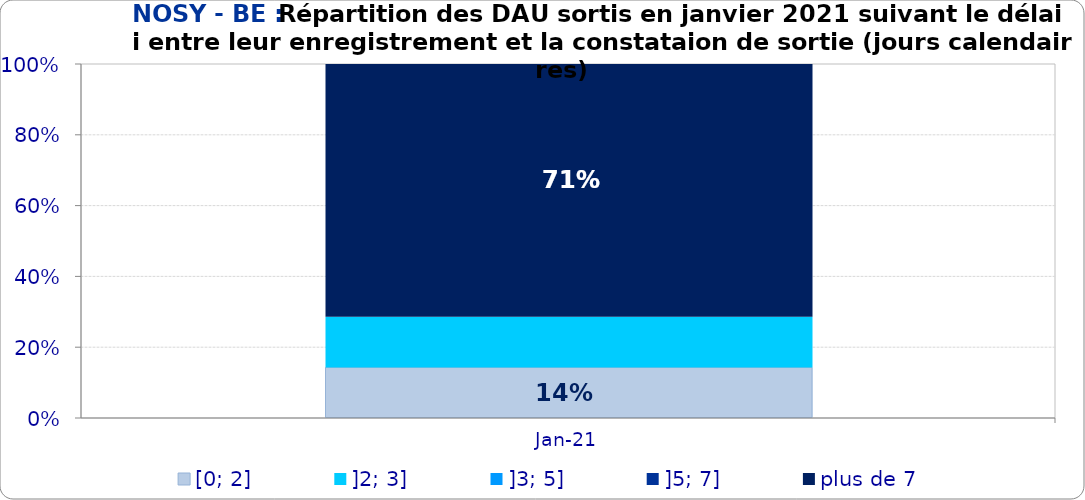
| Category | [0; 2] | ]2; 3] | ]3; 5] | ]5; 7] | plus de 7 |
|---|---|---|---|---|---|
| 2021-01-01 | 0.143 | 0.143 | 0 | 0 | 0.714 |